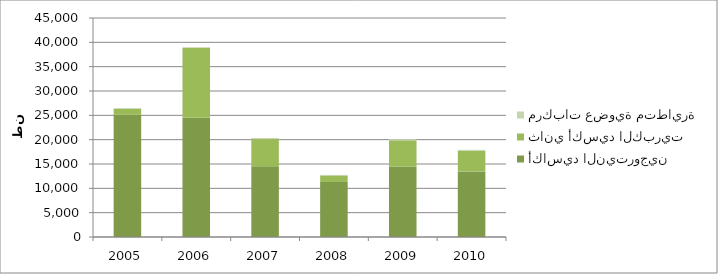
| Category | أكاسيد النيتروجين  | ثاني أكسيد الكبريت | مركبات عضوية متطايرة |
|---|---|---|---|
| 2005.0 | 25161.27 | 1141.07 | 167.06 |
| 2006.0 | 24490.5 | 14369.72 | 158.02 |
| 2007.0 | 14512.77 | 5606.26 | 210.59 |
| 2008.0 | 11307.25 | 1233.47 | 224.29 |
| 2009.0 | 14479.63 | 5383.04 | 231.03 |
| 2010.0 | 13481.088 | 4240.03 | 189 |